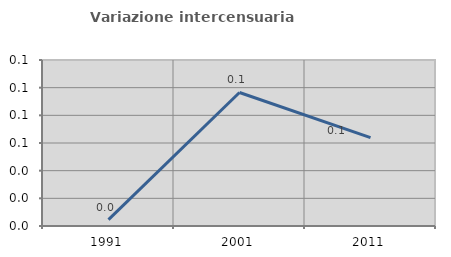
| Category | Variazione intercensuaria annua |
|---|---|
| 1991.0 | 0.005 |
| 2001.0 | 0.097 |
| 2011.0 | 0.064 |